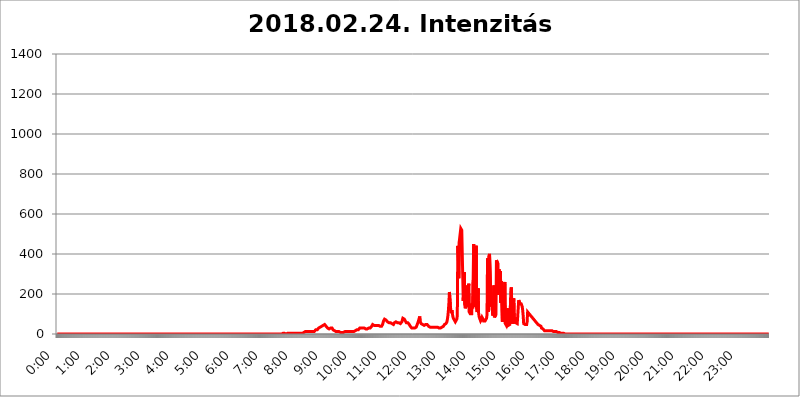
| Category | 2018.02.24. Intenzitás [W/m^2] |
|---|---|
| 0.0 | 0 |
| 0.0006944444444444445 | 0 |
| 0.001388888888888889 | 0 |
| 0.0020833333333333333 | 0 |
| 0.002777777777777778 | 0 |
| 0.003472222222222222 | 0 |
| 0.004166666666666667 | 0 |
| 0.004861111111111111 | 0 |
| 0.005555555555555556 | 0 |
| 0.0062499999999999995 | 0 |
| 0.006944444444444444 | 0 |
| 0.007638888888888889 | 0 |
| 0.008333333333333333 | 0 |
| 0.009027777777777779 | 0 |
| 0.009722222222222222 | 0 |
| 0.010416666666666666 | 0 |
| 0.011111111111111112 | 0 |
| 0.011805555555555555 | 0 |
| 0.012499999999999999 | 0 |
| 0.013194444444444444 | 0 |
| 0.013888888888888888 | 0 |
| 0.014583333333333332 | 0 |
| 0.015277777777777777 | 0 |
| 0.015972222222222224 | 0 |
| 0.016666666666666666 | 0 |
| 0.017361111111111112 | 0 |
| 0.018055555555555557 | 0 |
| 0.01875 | 0 |
| 0.019444444444444445 | 0 |
| 0.02013888888888889 | 0 |
| 0.020833333333333332 | 0 |
| 0.02152777777777778 | 0 |
| 0.022222222222222223 | 0 |
| 0.02291666666666667 | 0 |
| 0.02361111111111111 | 0 |
| 0.024305555555555556 | 0 |
| 0.024999999999999998 | 0 |
| 0.025694444444444447 | 0 |
| 0.02638888888888889 | 0 |
| 0.027083333333333334 | 0 |
| 0.027777777777777776 | 0 |
| 0.02847222222222222 | 0 |
| 0.029166666666666664 | 0 |
| 0.029861111111111113 | 0 |
| 0.030555555555555555 | 0 |
| 0.03125 | 0 |
| 0.03194444444444445 | 0 |
| 0.03263888888888889 | 0 |
| 0.03333333333333333 | 0 |
| 0.034027777777777775 | 0 |
| 0.034722222222222224 | 0 |
| 0.035416666666666666 | 0 |
| 0.036111111111111115 | 0 |
| 0.03680555555555556 | 0 |
| 0.0375 | 0 |
| 0.03819444444444444 | 0 |
| 0.03888888888888889 | 0 |
| 0.03958333333333333 | 0 |
| 0.04027777777777778 | 0 |
| 0.04097222222222222 | 0 |
| 0.041666666666666664 | 0 |
| 0.042361111111111106 | 0 |
| 0.04305555555555556 | 0 |
| 0.043750000000000004 | 0 |
| 0.044444444444444446 | 0 |
| 0.04513888888888889 | 0 |
| 0.04583333333333334 | 0 |
| 0.04652777777777778 | 0 |
| 0.04722222222222222 | 0 |
| 0.04791666666666666 | 0 |
| 0.04861111111111111 | 0 |
| 0.049305555555555554 | 0 |
| 0.049999999999999996 | 0 |
| 0.05069444444444445 | 0 |
| 0.051388888888888894 | 0 |
| 0.052083333333333336 | 0 |
| 0.05277777777777778 | 0 |
| 0.05347222222222222 | 0 |
| 0.05416666666666667 | 0 |
| 0.05486111111111111 | 0 |
| 0.05555555555555555 | 0 |
| 0.05625 | 0 |
| 0.05694444444444444 | 0 |
| 0.057638888888888885 | 0 |
| 0.05833333333333333 | 0 |
| 0.05902777777777778 | 0 |
| 0.059722222222222225 | 0 |
| 0.06041666666666667 | 0 |
| 0.061111111111111116 | 0 |
| 0.06180555555555556 | 0 |
| 0.0625 | 0 |
| 0.06319444444444444 | 0 |
| 0.06388888888888888 | 0 |
| 0.06458333333333334 | 0 |
| 0.06527777777777778 | 0 |
| 0.06597222222222222 | 0 |
| 0.06666666666666667 | 0 |
| 0.06736111111111111 | 0 |
| 0.06805555555555555 | 0 |
| 0.06874999999999999 | 0 |
| 0.06944444444444443 | 0 |
| 0.07013888888888889 | 0 |
| 0.07083333333333333 | 0 |
| 0.07152777777777779 | 0 |
| 0.07222222222222223 | 0 |
| 0.07291666666666667 | 0 |
| 0.07361111111111111 | 0 |
| 0.07430555555555556 | 0 |
| 0.075 | 0 |
| 0.07569444444444444 | 0 |
| 0.0763888888888889 | 0 |
| 0.07708333333333334 | 0 |
| 0.07777777777777778 | 0 |
| 0.07847222222222222 | 0 |
| 0.07916666666666666 | 0 |
| 0.0798611111111111 | 0 |
| 0.08055555555555556 | 0 |
| 0.08125 | 0 |
| 0.08194444444444444 | 0 |
| 0.08263888888888889 | 0 |
| 0.08333333333333333 | 0 |
| 0.08402777777777777 | 0 |
| 0.08472222222222221 | 0 |
| 0.08541666666666665 | 0 |
| 0.08611111111111112 | 0 |
| 0.08680555555555557 | 0 |
| 0.08750000000000001 | 0 |
| 0.08819444444444445 | 0 |
| 0.08888888888888889 | 0 |
| 0.08958333333333333 | 0 |
| 0.09027777777777778 | 0 |
| 0.09097222222222222 | 0 |
| 0.09166666666666667 | 0 |
| 0.09236111111111112 | 0 |
| 0.09305555555555556 | 0 |
| 0.09375 | 0 |
| 0.09444444444444444 | 0 |
| 0.09513888888888888 | 0 |
| 0.09583333333333333 | 0 |
| 0.09652777777777777 | 0 |
| 0.09722222222222222 | 0 |
| 0.09791666666666667 | 0 |
| 0.09861111111111111 | 0 |
| 0.09930555555555555 | 0 |
| 0.09999999999999999 | 0 |
| 0.10069444444444443 | 0 |
| 0.1013888888888889 | 0 |
| 0.10208333333333335 | 0 |
| 0.10277777777777779 | 0 |
| 0.10347222222222223 | 0 |
| 0.10416666666666667 | 0 |
| 0.10486111111111111 | 0 |
| 0.10555555555555556 | 0 |
| 0.10625 | 0 |
| 0.10694444444444444 | 0 |
| 0.1076388888888889 | 0 |
| 0.10833333333333334 | 0 |
| 0.10902777777777778 | 0 |
| 0.10972222222222222 | 0 |
| 0.1111111111111111 | 0 |
| 0.11180555555555556 | 0 |
| 0.11180555555555556 | 0 |
| 0.1125 | 0 |
| 0.11319444444444444 | 0 |
| 0.11388888888888889 | 0 |
| 0.11458333333333333 | 0 |
| 0.11527777777777777 | 0 |
| 0.11597222222222221 | 0 |
| 0.11666666666666665 | 0 |
| 0.1173611111111111 | 0 |
| 0.11805555555555557 | 0 |
| 0.11944444444444445 | 0 |
| 0.12013888888888889 | 0 |
| 0.12083333333333333 | 0 |
| 0.12152777777777778 | 0 |
| 0.12222222222222223 | 0 |
| 0.12291666666666667 | 0 |
| 0.12291666666666667 | 0 |
| 0.12361111111111112 | 0 |
| 0.12430555555555556 | 0 |
| 0.125 | 0 |
| 0.12569444444444444 | 0 |
| 0.12638888888888888 | 0 |
| 0.12708333333333333 | 0 |
| 0.16875 | 0 |
| 0.12847222222222224 | 0 |
| 0.12916666666666668 | 0 |
| 0.12986111111111112 | 0 |
| 0.13055555555555556 | 0 |
| 0.13125 | 0 |
| 0.13194444444444445 | 0 |
| 0.1326388888888889 | 0 |
| 0.13333333333333333 | 0 |
| 0.13402777777777777 | 0 |
| 0.13402777777777777 | 0 |
| 0.13472222222222222 | 0 |
| 0.13541666666666666 | 0 |
| 0.1361111111111111 | 0 |
| 0.13749999999999998 | 0 |
| 0.13819444444444443 | 0 |
| 0.1388888888888889 | 0 |
| 0.13958333333333334 | 0 |
| 0.14027777777777778 | 0 |
| 0.14097222222222222 | 0 |
| 0.14166666666666666 | 0 |
| 0.1423611111111111 | 0 |
| 0.14305555555555557 | 0 |
| 0.14375000000000002 | 0 |
| 0.14444444444444446 | 0 |
| 0.1451388888888889 | 0 |
| 0.1451388888888889 | 0 |
| 0.14652777777777778 | 0 |
| 0.14722222222222223 | 0 |
| 0.14791666666666667 | 0 |
| 0.1486111111111111 | 0 |
| 0.14930555555555555 | 0 |
| 0.15 | 0 |
| 0.15069444444444444 | 0 |
| 0.15138888888888888 | 0 |
| 0.15208333333333332 | 0 |
| 0.15277777777777776 | 0 |
| 0.15347222222222223 | 0 |
| 0.15416666666666667 | 0 |
| 0.15486111111111112 | 0 |
| 0.15555555555555556 | 0 |
| 0.15625 | 0 |
| 0.15694444444444444 | 0 |
| 0.15763888888888888 | 0 |
| 0.15833333333333333 | 0 |
| 0.15902777777777777 | 0 |
| 0.15972222222222224 | 0 |
| 0.16041666666666668 | 0 |
| 0.16111111111111112 | 0 |
| 0.16180555555555556 | 0 |
| 0.1625 | 0 |
| 0.16319444444444445 | 0 |
| 0.1638888888888889 | 0 |
| 0.16458333333333333 | 0 |
| 0.16527777777777777 | 0 |
| 0.16597222222222222 | 0 |
| 0.16666666666666666 | 0 |
| 0.1673611111111111 | 0 |
| 0.16805555555555554 | 0 |
| 0.16874999999999998 | 0 |
| 0.16944444444444443 | 0 |
| 0.17013888888888887 | 0 |
| 0.1708333333333333 | 0 |
| 0.17152777777777775 | 0 |
| 0.17222222222222225 | 0 |
| 0.1729166666666667 | 0 |
| 0.17361111111111113 | 0 |
| 0.17430555555555557 | 0 |
| 0.17500000000000002 | 0 |
| 0.17569444444444446 | 0 |
| 0.1763888888888889 | 0 |
| 0.17708333333333334 | 0 |
| 0.17777777777777778 | 0 |
| 0.17847222222222223 | 0 |
| 0.17916666666666667 | 0 |
| 0.1798611111111111 | 0 |
| 0.18055555555555555 | 0 |
| 0.18125 | 0 |
| 0.18194444444444444 | 0 |
| 0.1826388888888889 | 0 |
| 0.18333333333333335 | 0 |
| 0.1840277777777778 | 0 |
| 0.18472222222222223 | 0 |
| 0.18541666666666667 | 0 |
| 0.18611111111111112 | 0 |
| 0.18680555555555556 | 0 |
| 0.1875 | 0 |
| 0.18819444444444444 | 0 |
| 0.18888888888888888 | 0 |
| 0.18958333333333333 | 0 |
| 0.19027777777777777 | 0 |
| 0.1909722222222222 | 0 |
| 0.19166666666666665 | 0 |
| 0.19236111111111112 | 0 |
| 0.19305555555555554 | 0 |
| 0.19375 | 0 |
| 0.19444444444444445 | 0 |
| 0.1951388888888889 | 0 |
| 0.19583333333333333 | 0 |
| 0.19652777777777777 | 0 |
| 0.19722222222222222 | 0 |
| 0.19791666666666666 | 0 |
| 0.1986111111111111 | 0 |
| 0.19930555555555554 | 0 |
| 0.19999999999999998 | 0 |
| 0.20069444444444443 | 0 |
| 0.20138888888888887 | 0 |
| 0.2020833333333333 | 0 |
| 0.2027777777777778 | 0 |
| 0.2034722222222222 | 0 |
| 0.2041666666666667 | 0 |
| 0.20486111111111113 | 0 |
| 0.20555555555555557 | 0 |
| 0.20625000000000002 | 0 |
| 0.20694444444444446 | 0 |
| 0.2076388888888889 | 0 |
| 0.20833333333333334 | 0 |
| 0.20902777777777778 | 0 |
| 0.20972222222222223 | 0 |
| 0.21041666666666667 | 0 |
| 0.2111111111111111 | 0 |
| 0.21180555555555555 | 0 |
| 0.2125 | 0 |
| 0.21319444444444444 | 0 |
| 0.2138888888888889 | 0 |
| 0.21458333333333335 | 0 |
| 0.2152777777777778 | 0 |
| 0.21597222222222223 | 0 |
| 0.21666666666666667 | 0 |
| 0.21736111111111112 | 0 |
| 0.21805555555555556 | 0 |
| 0.21875 | 0 |
| 0.21944444444444444 | 0 |
| 0.22013888888888888 | 0 |
| 0.22083333333333333 | 0 |
| 0.22152777777777777 | 0 |
| 0.2222222222222222 | 0 |
| 0.22291666666666665 | 0 |
| 0.2236111111111111 | 0 |
| 0.22430555555555556 | 0 |
| 0.225 | 0 |
| 0.22569444444444445 | 0 |
| 0.2263888888888889 | 0 |
| 0.22708333333333333 | 0 |
| 0.22777777777777777 | 0 |
| 0.22847222222222222 | 0 |
| 0.22916666666666666 | 0 |
| 0.2298611111111111 | 0 |
| 0.23055555555555554 | 0 |
| 0.23124999999999998 | 0 |
| 0.23194444444444443 | 0 |
| 0.23263888888888887 | 0 |
| 0.2333333333333333 | 0 |
| 0.2340277777777778 | 0 |
| 0.2347222222222222 | 0 |
| 0.2354166666666667 | 0 |
| 0.23611111111111113 | 0 |
| 0.23680555555555557 | 0 |
| 0.23750000000000002 | 0 |
| 0.23819444444444446 | 0 |
| 0.2388888888888889 | 0 |
| 0.23958333333333334 | 0 |
| 0.24027777777777778 | 0 |
| 0.24097222222222223 | 0 |
| 0.24166666666666667 | 0 |
| 0.2423611111111111 | 0 |
| 0.24305555555555555 | 0 |
| 0.24375 | 0 |
| 0.24444444444444446 | 0 |
| 0.24513888888888888 | 0 |
| 0.24583333333333335 | 0 |
| 0.2465277777777778 | 0 |
| 0.24722222222222223 | 0 |
| 0.24791666666666667 | 0 |
| 0.24861111111111112 | 0 |
| 0.24930555555555556 | 0 |
| 0.25 | 0 |
| 0.25069444444444444 | 0 |
| 0.2513888888888889 | 0 |
| 0.2520833333333333 | 0 |
| 0.25277777777777777 | 0 |
| 0.2534722222222222 | 0 |
| 0.25416666666666665 | 0 |
| 0.2548611111111111 | 0 |
| 0.2555555555555556 | 0 |
| 0.25625000000000003 | 0 |
| 0.2569444444444445 | 0 |
| 0.2576388888888889 | 0 |
| 0.25833333333333336 | 0 |
| 0.2590277777777778 | 0 |
| 0.25972222222222224 | 0 |
| 0.2604166666666667 | 0 |
| 0.2611111111111111 | 0 |
| 0.26180555555555557 | 0 |
| 0.2625 | 0 |
| 0.26319444444444445 | 0 |
| 0.2638888888888889 | 0 |
| 0.26458333333333334 | 0 |
| 0.2652777777777778 | 0 |
| 0.2659722222222222 | 0 |
| 0.26666666666666666 | 0 |
| 0.2673611111111111 | 0 |
| 0.26805555555555555 | 0 |
| 0.26875 | 0 |
| 0.26944444444444443 | 0 |
| 0.2701388888888889 | 0 |
| 0.2708333333333333 | 0 |
| 0.27152777777777776 | 0 |
| 0.2722222222222222 | 0 |
| 0.27291666666666664 | 0 |
| 0.2736111111111111 | 0 |
| 0.2743055555555555 | 0 |
| 0.27499999999999997 | 0 |
| 0.27569444444444446 | 0 |
| 0.27638888888888885 | 0 |
| 0.27708333333333335 | 0 |
| 0.2777777777777778 | 0 |
| 0.27847222222222223 | 0 |
| 0.2791666666666667 | 0 |
| 0.2798611111111111 | 0 |
| 0.28055555555555556 | 0 |
| 0.28125 | 0 |
| 0.28194444444444444 | 0 |
| 0.2826388888888889 | 0 |
| 0.2833333333333333 | 0 |
| 0.28402777777777777 | 0 |
| 0.2847222222222222 | 0 |
| 0.28541666666666665 | 0 |
| 0.28611111111111115 | 0 |
| 0.28680555555555554 | 0 |
| 0.28750000000000003 | 0 |
| 0.2881944444444445 | 0 |
| 0.2888888888888889 | 0 |
| 0.28958333333333336 | 0 |
| 0.2902777777777778 | 0 |
| 0.29097222222222224 | 0 |
| 0.2916666666666667 | 0 |
| 0.2923611111111111 | 0 |
| 0.29305555555555557 | 0 |
| 0.29375 | 0 |
| 0.29444444444444445 | 0 |
| 0.2951388888888889 | 0 |
| 0.29583333333333334 | 0 |
| 0.2965277777777778 | 0 |
| 0.2972222222222222 | 0 |
| 0.29791666666666666 | 0 |
| 0.2986111111111111 | 0 |
| 0.29930555555555555 | 0 |
| 0.3 | 0 |
| 0.30069444444444443 | 0 |
| 0.3013888888888889 | 0 |
| 0.3020833333333333 | 0 |
| 0.30277777777777776 | 0 |
| 0.3034722222222222 | 0 |
| 0.30416666666666664 | 0 |
| 0.3048611111111111 | 0 |
| 0.3055555555555555 | 0 |
| 0.30624999999999997 | 0 |
| 0.3069444444444444 | 0 |
| 0.3076388888888889 | 0 |
| 0.30833333333333335 | 0 |
| 0.3090277777777778 | 0 |
| 0.30972222222222223 | 0 |
| 0.3104166666666667 | 0 |
| 0.3111111111111111 | 0 |
| 0.31180555555555556 | 0 |
| 0.3125 | 0 |
| 0.31319444444444444 | 0 |
| 0.3138888888888889 | 0 |
| 0.3145833333333333 | 0 |
| 0.31527777777777777 | 3.525 |
| 0.3159722222222222 | 0 |
| 0.31666666666666665 | 3.525 |
| 0.31736111111111115 | 3.525 |
| 0.31805555555555554 | 3.525 |
| 0.31875000000000003 | 3.525 |
| 0.3194444444444445 | 3.525 |
| 0.3201388888888889 | 3.525 |
| 0.32083333333333336 | 0 |
| 0.3215277777777778 | 3.525 |
| 0.32222222222222224 | 3.525 |
| 0.3229166666666667 | 3.525 |
| 0.3236111111111111 | 3.525 |
| 0.32430555555555557 | 3.525 |
| 0.325 | 3.525 |
| 0.32569444444444445 | 3.525 |
| 0.3263888888888889 | 3.525 |
| 0.32708333333333334 | 3.525 |
| 0.3277777777777778 | 3.525 |
| 0.3284722222222222 | 3.525 |
| 0.32916666666666666 | 3.525 |
| 0.3298611111111111 | 3.525 |
| 0.33055555555555555 | 3.525 |
| 0.33125 | 3.525 |
| 0.33194444444444443 | 0 |
| 0.3326388888888889 | 3.525 |
| 0.3333333333333333 | 3.525 |
| 0.3340277777777778 | 3.525 |
| 0.3347222222222222 | 3.525 |
| 0.3354166666666667 | 3.525 |
| 0.3361111111111111 | 3.525 |
| 0.3368055555555556 | 3.525 |
| 0.33749999999999997 | 3.525 |
| 0.33819444444444446 | 3.525 |
| 0.33888888888888885 | 3.525 |
| 0.33958333333333335 | 3.525 |
| 0.34027777777777773 | 3.525 |
| 0.34097222222222223 | 3.525 |
| 0.3416666666666666 | 3.525 |
| 0.3423611111111111 | 3.525 |
| 0.3430555555555555 | 3.525 |
| 0.34375 | 3.525 |
| 0.3444444444444445 | 7.887 |
| 0.3451388888888889 | 7.887 |
| 0.3458333333333334 | 7.887 |
| 0.34652777777777777 | 7.887 |
| 0.34722222222222227 | 7.887 |
| 0.34791666666666665 | 12.257 |
| 0.34861111111111115 | 12.257 |
| 0.34930555555555554 | 12.257 |
| 0.35000000000000003 | 12.257 |
| 0.3506944444444444 | 12.257 |
| 0.3513888888888889 | 12.257 |
| 0.3520833333333333 | 12.257 |
| 0.3527777777777778 | 12.257 |
| 0.3534722222222222 | 12.257 |
| 0.3541666666666667 | 12.257 |
| 0.3548611111111111 | 12.257 |
| 0.35555555555555557 | 12.257 |
| 0.35625 | 12.257 |
| 0.35694444444444445 | 12.257 |
| 0.3576388888888889 | 12.257 |
| 0.35833333333333334 | 12.257 |
| 0.3590277777777778 | 12.257 |
| 0.3597222222222222 | 12.257 |
| 0.36041666666666666 | 12.257 |
| 0.3611111111111111 | 12.257 |
| 0.36180555555555555 | 16.636 |
| 0.3625 | 21.024 |
| 0.36319444444444443 | 21.024 |
| 0.3638888888888889 | 21.024 |
| 0.3645833333333333 | 21.024 |
| 0.3652777777777778 | 25.419 |
| 0.3659722222222222 | 25.419 |
| 0.3666666666666667 | 29.823 |
| 0.3673611111111111 | 34.234 |
| 0.3680555555555556 | 34.234 |
| 0.36874999999999997 | 34.234 |
| 0.36944444444444446 | 34.234 |
| 0.37013888888888885 | 34.234 |
| 0.37083333333333335 | 38.653 |
| 0.37152777777777773 | 38.653 |
| 0.37222222222222223 | 43.079 |
| 0.3729166666666666 | 43.079 |
| 0.3736111111111111 | 43.079 |
| 0.3743055555555555 | 47.511 |
| 0.375 | 47.511 |
| 0.3756944444444445 | 43.079 |
| 0.3763888888888889 | 43.079 |
| 0.3770833333333334 | 38.653 |
| 0.37777777777777777 | 38.653 |
| 0.37847222222222227 | 34.234 |
| 0.37916666666666665 | 29.823 |
| 0.37986111111111115 | 29.823 |
| 0.38055555555555554 | 25.419 |
| 0.38125000000000003 | 25.419 |
| 0.3819444444444444 | 25.419 |
| 0.3826388888888889 | 25.419 |
| 0.3833333333333333 | 29.823 |
| 0.3840277777777778 | 34.234 |
| 0.3847222222222222 | 34.234 |
| 0.3854166666666667 | 29.823 |
| 0.3861111111111111 | 25.419 |
| 0.38680555555555557 | 21.024 |
| 0.3875 | 21.024 |
| 0.38819444444444445 | 16.636 |
| 0.3888888888888889 | 16.636 |
| 0.38958333333333334 | 12.257 |
| 0.3902777777777778 | 12.257 |
| 0.3909722222222222 | 12.257 |
| 0.39166666666666666 | 12.257 |
| 0.3923611111111111 | 12.257 |
| 0.39305555555555555 | 12.257 |
| 0.39375 | 12.257 |
| 0.39444444444444443 | 12.257 |
| 0.3951388888888889 | 12.257 |
| 0.3958333333333333 | 7.887 |
| 0.3965277777777778 | 7.887 |
| 0.3972222222222222 | 7.887 |
| 0.3979166666666667 | 7.887 |
| 0.3986111111111111 | 7.887 |
| 0.3993055555555556 | 7.887 |
| 0.39999999999999997 | 7.887 |
| 0.40069444444444446 | 7.887 |
| 0.40138888888888885 | 7.887 |
| 0.40208333333333335 | 7.887 |
| 0.40277777777777773 | 7.887 |
| 0.40347222222222223 | 12.257 |
| 0.4041666666666666 | 12.257 |
| 0.4048611111111111 | 12.257 |
| 0.4055555555555555 | 12.257 |
| 0.40625 | 12.257 |
| 0.4069444444444445 | 12.257 |
| 0.4076388888888889 | 12.257 |
| 0.4083333333333334 | 12.257 |
| 0.40902777777777777 | 12.257 |
| 0.40972222222222227 | 12.257 |
| 0.41041666666666665 | 12.257 |
| 0.41111111111111115 | 12.257 |
| 0.41180555555555554 | 12.257 |
| 0.41250000000000003 | 12.257 |
| 0.4131944444444444 | 12.257 |
| 0.4138888888888889 | 12.257 |
| 0.4145833333333333 | 12.257 |
| 0.4152777777777778 | 12.257 |
| 0.4159722222222222 | 12.257 |
| 0.4166666666666667 | 12.257 |
| 0.4173611111111111 | 16.636 |
| 0.41805555555555557 | 16.636 |
| 0.41875 | 16.636 |
| 0.41944444444444445 | 16.636 |
| 0.4201388888888889 | 21.024 |
| 0.42083333333333334 | 21.024 |
| 0.4215277777777778 | 21.024 |
| 0.4222222222222222 | 21.024 |
| 0.42291666666666666 | 25.419 |
| 0.4236111111111111 | 25.419 |
| 0.42430555555555555 | 29.823 |
| 0.425 | 29.823 |
| 0.42569444444444443 | 29.823 |
| 0.4263888888888889 | 29.823 |
| 0.4270833333333333 | 29.823 |
| 0.4277777777777778 | 29.823 |
| 0.4284722222222222 | 29.823 |
| 0.4291666666666667 | 29.823 |
| 0.4298611111111111 | 29.823 |
| 0.4305555555555556 | 29.823 |
| 0.43124999999999997 | 29.823 |
| 0.43194444444444446 | 25.419 |
| 0.43263888888888885 | 25.419 |
| 0.43333333333333335 | 25.419 |
| 0.43402777777777773 | 25.419 |
| 0.43472222222222223 | 25.419 |
| 0.4354166666666666 | 25.419 |
| 0.4361111111111111 | 29.823 |
| 0.4368055555555555 | 29.823 |
| 0.4375 | 29.823 |
| 0.4381944444444445 | 25.419 |
| 0.4388888888888889 | 29.823 |
| 0.4395833333333334 | 29.823 |
| 0.44027777777777777 | 34.234 |
| 0.44097222222222227 | 38.653 |
| 0.44166666666666665 | 43.079 |
| 0.44236111111111115 | 47.511 |
| 0.44305555555555554 | 47.511 |
| 0.44375000000000003 | 47.511 |
| 0.4444444444444444 | 43.079 |
| 0.4451388888888889 | 43.079 |
| 0.4458333333333333 | 43.079 |
| 0.4465277777777778 | 43.079 |
| 0.4472222222222222 | 43.079 |
| 0.4479166666666667 | 43.079 |
| 0.4486111111111111 | 43.079 |
| 0.44930555555555557 | 43.079 |
| 0.45 | 43.079 |
| 0.45069444444444445 | 43.079 |
| 0.4513888888888889 | 43.079 |
| 0.45208333333333334 | 43.079 |
| 0.4527777777777778 | 38.653 |
| 0.4534722222222222 | 38.653 |
| 0.45416666666666666 | 38.653 |
| 0.4548611111111111 | 38.653 |
| 0.45555555555555555 | 43.079 |
| 0.45625 | 47.511 |
| 0.45694444444444443 | 56.398 |
| 0.4576388888888889 | 65.31 |
| 0.4583333333333333 | 69.775 |
| 0.4590277777777778 | 74.246 |
| 0.4597222222222222 | 74.246 |
| 0.4604166666666667 | 74.246 |
| 0.4611111111111111 | 69.775 |
| 0.4618055555555556 | 69.775 |
| 0.46249999999999997 | 65.31 |
| 0.46319444444444446 | 60.85 |
| 0.46388888888888885 | 60.85 |
| 0.46458333333333335 | 56.398 |
| 0.46527777777777773 | 56.398 |
| 0.46597222222222223 | 56.398 |
| 0.4666666666666666 | 56.398 |
| 0.4673611111111111 | 56.398 |
| 0.4680555555555555 | 56.398 |
| 0.46875 | 56.398 |
| 0.4694444444444445 | 51.951 |
| 0.4701388888888889 | 51.951 |
| 0.4708333333333334 | 51.951 |
| 0.47152777777777777 | 47.511 |
| 0.47222222222222227 | 51.951 |
| 0.47291666666666665 | 56.398 |
| 0.47361111111111115 | 56.398 |
| 0.47430555555555554 | 60.85 |
| 0.47500000000000003 | 60.85 |
| 0.4756944444444444 | 56.398 |
| 0.4763888888888889 | 56.398 |
| 0.4770833333333333 | 56.398 |
| 0.4777777777777778 | 51.951 |
| 0.4784722222222222 | 51.951 |
| 0.4791666666666667 | 56.398 |
| 0.4798611111111111 | 56.398 |
| 0.48055555555555557 | 56.398 |
| 0.48125 | 51.951 |
| 0.48194444444444445 | 51.951 |
| 0.4826388888888889 | 51.951 |
| 0.48333333333333334 | 60.85 |
| 0.4840277777777778 | 65.31 |
| 0.4847222222222222 | 78.722 |
| 0.48541666666666666 | 78.722 |
| 0.4861111111111111 | 74.246 |
| 0.48680555555555555 | 74.246 |
| 0.4875 | 69.775 |
| 0.48819444444444443 | 65.31 |
| 0.4888888888888889 | 60.85 |
| 0.4895833333333333 | 56.398 |
| 0.4902777777777778 | 56.398 |
| 0.4909722222222222 | 56.398 |
| 0.4916666666666667 | 56.398 |
| 0.4923611111111111 | 56.398 |
| 0.4930555555555556 | 51.951 |
| 0.49374999999999997 | 47.511 |
| 0.49444444444444446 | 43.079 |
| 0.49513888888888885 | 38.653 |
| 0.49583333333333335 | 38.653 |
| 0.49652777777777773 | 34.234 |
| 0.49722222222222223 | 29.823 |
| 0.4979166666666666 | 29.823 |
| 0.4986111111111111 | 29.823 |
| 0.4993055555555555 | 29.823 |
| 0.5 | 29.823 |
| 0.5006944444444444 | 29.823 |
| 0.5013888888888889 | 29.823 |
| 0.5020833333333333 | 29.823 |
| 0.5027777777777778 | 29.823 |
| 0.5034722222222222 | 34.234 |
| 0.5041666666666667 | 38.653 |
| 0.5048611111111111 | 47.511 |
| 0.5055555555555555 | 51.951 |
| 0.50625 | 60.85 |
| 0.5069444444444444 | 69.775 |
| 0.5076388888888889 | 69.775 |
| 0.5083333333333333 | 87.692 |
| 0.5090277777777777 | 60.85 |
| 0.5097222222222222 | 56.398 |
| 0.5104166666666666 | 51.951 |
| 0.5111111111111112 | 47.511 |
| 0.5118055555555555 | 47.511 |
| 0.5125000000000001 | 47.511 |
| 0.5131944444444444 | 43.079 |
| 0.513888888888889 | 43.079 |
| 0.5145833333333333 | 43.079 |
| 0.5152777777777778 | 43.079 |
| 0.5159722222222222 | 47.511 |
| 0.5166666666666667 | 47.511 |
| 0.517361111111111 | 51.951 |
| 0.5180555555555556 | 47.511 |
| 0.5187499999999999 | 47.511 |
| 0.5194444444444445 | 43.079 |
| 0.5201388888888888 | 43.079 |
| 0.5208333333333334 | 38.653 |
| 0.5215277777777778 | 38.653 |
| 0.5222222222222223 | 34.234 |
| 0.5229166666666667 | 34.234 |
| 0.5236111111111111 | 34.234 |
| 0.5243055555555556 | 34.234 |
| 0.525 | 34.234 |
| 0.5256944444444445 | 34.234 |
| 0.5263888888888889 | 34.234 |
| 0.5270833333333333 | 34.234 |
| 0.5277777777777778 | 34.234 |
| 0.5284722222222222 | 34.234 |
| 0.5291666666666667 | 34.234 |
| 0.5298611111111111 | 34.234 |
| 0.5305555555555556 | 34.234 |
| 0.53125 | 34.234 |
| 0.5319444444444444 | 34.234 |
| 0.5326388888888889 | 34.234 |
| 0.5333333333333333 | 34.234 |
| 0.5340277777777778 | 34.234 |
| 0.5347222222222222 | 29.823 |
| 0.5354166666666667 | 29.823 |
| 0.5361111111111111 | 29.823 |
| 0.5368055555555555 | 29.823 |
| 0.5375 | 29.823 |
| 0.5381944444444444 | 29.823 |
| 0.5388888888888889 | 29.823 |
| 0.5395833333333333 | 34.234 |
| 0.5402777777777777 | 34.234 |
| 0.5409722222222222 | 38.653 |
| 0.5416666666666666 | 38.653 |
| 0.5423611111111112 | 43.079 |
| 0.5430555555555555 | 47.511 |
| 0.5437500000000001 | 51.951 |
| 0.5444444444444444 | 51.951 |
| 0.545138888888889 | 51.951 |
| 0.5458333333333333 | 56.398 |
| 0.5465277777777778 | 60.85 |
| 0.5472222222222222 | 74.246 |
| 0.5479166666666667 | 92.184 |
| 0.548611111111111 | 119.235 |
| 0.5493055555555556 | 155.509 |
| 0.5499999999999999 | 210.182 |
| 0.5506944444444445 | 205.62 |
| 0.5513888888888888 | 141.884 |
| 0.5520833333333334 | 114.716 |
| 0.5527777777777778 | 105.69 |
| 0.5534722222222223 | 119.235 |
| 0.5541666666666667 | 101.184 |
| 0.5548611111111111 | 87.692 |
| 0.5555555555555556 | 78.722 |
| 0.55625 | 74.246 |
| 0.5569444444444445 | 69.775 |
| 0.5576388888888889 | 65.31 |
| 0.5583333333333333 | 60.85 |
| 0.5590277777777778 | 56.398 |
| 0.5597222222222222 | 60.85 |
| 0.5604166666666667 | 74.246 |
| 0.5611111111111111 | 92.184 |
| 0.5618055555555556 | 440.702 |
| 0.5625 | 382.715 |
| 0.5631944444444444 | 278.603 |
| 0.5638888888888889 | 462.786 |
| 0.5645833333333333 | 458.38 |
| 0.5652777777777778 | 506.542 |
| 0.5659722222222222 | 528.2 |
| 0.5666666666666667 | 532.513 |
| 0.5673611111111111 | 519.555 |
| 0.5680555555555555 | 519.555 |
| 0.56875 | 523.88 |
| 0.5694444444444444 | 164.605 |
| 0.5701388888888889 | 160.056 |
| 0.5708333333333333 | 310.44 |
| 0.5715277777777777 | 146.423 |
| 0.5722222222222222 | 128.284 |
| 0.5729166666666666 | 137.347 |
| 0.5736111111111112 | 137.347 |
| 0.5743055555555555 | 155.509 |
| 0.5750000000000001 | 242.127 |
| 0.5756944444444444 | 137.347 |
| 0.576388888888889 | 132.814 |
| 0.5770833333333333 | 251.251 |
| 0.5777777777777778 | 110.201 |
| 0.5784722222222222 | 105.69 |
| 0.5791666666666667 | 101.184 |
| 0.579861111111111 | 101.184 |
| 0.5805555555555556 | 105.69 |
| 0.5812499999999999 | 101.184 |
| 0.5819444444444445 | 155.509 |
| 0.5826388888888888 | 128.284 |
| 0.5833333333333334 | 269.49 |
| 0.5840277777777778 | 449.551 |
| 0.5847222222222223 | 146.423 |
| 0.5854166666666667 | 137.347 |
| 0.5861111111111111 | 274.047 |
| 0.5868055555555556 | 137.347 |
| 0.5875 | 440.702 |
| 0.5881944444444445 | 128.284 |
| 0.5888888888888889 | 110.201 |
| 0.5895833333333333 | 105.69 |
| 0.5902777777777778 | 228.436 |
| 0.5909722222222222 | 105.69 |
| 0.5916666666666667 | 87.692 |
| 0.5923611111111111 | 78.722 |
| 0.5930555555555556 | 74.246 |
| 0.59375 | 65.31 |
| 0.5944444444444444 | 65.31 |
| 0.5951388888888889 | 74.246 |
| 0.5958333333333333 | 83.205 |
| 0.5965277777777778 | 83.205 |
| 0.5972222222222222 | 74.246 |
| 0.5979166666666667 | 65.31 |
| 0.5986111111111111 | 65.31 |
| 0.5993055555555555 | 65.31 |
| 0.6 | 65.31 |
| 0.6006944444444444 | 65.31 |
| 0.6013888888888889 | 65.31 |
| 0.6020833333333333 | 78.722 |
| 0.6027777777777777 | 96.682 |
| 0.6034722222222222 | 378.224 |
| 0.6041666666666666 | 301.354 |
| 0.6048611111111112 | 110.201 |
| 0.6055555555555555 | 391.685 |
| 0.6062500000000001 | 400.638 |
| 0.6069444444444444 | 396.164 |
| 0.607638888888889 | 405.108 |
| 0.6083333333333333 | 169.156 |
| 0.6090277777777778 | 137.347 |
| 0.6097222222222222 | 182.82 |
| 0.6104166666666667 | 101.184 |
| 0.611111111111111 | 92.184 |
| 0.6118055555555556 | 96.682 |
| 0.6124999999999999 | 242.127 |
| 0.6131944444444445 | 83.205 |
| 0.6138888888888888 | 83.205 |
| 0.6145833333333334 | 83.205 |
| 0.6152777777777778 | 96.682 |
| 0.6159722222222223 | 369.23 |
| 0.6166666666666667 | 369.23 |
| 0.6173611111111111 | 364.728 |
| 0.6180555555555556 | 351.198 |
| 0.61875 | 196.497 |
| 0.6194444444444445 | 324.052 |
| 0.6201388888888889 | 214.746 |
| 0.6208333333333333 | 278.603 |
| 0.6215277777777778 | 314.98 |
| 0.6222222222222222 | 155.509 |
| 0.6229166666666667 | 264.932 |
| 0.6236111111111111 | 269.49 |
| 0.6243055555555556 | 60.85 |
| 0.625 | 56.398 |
| 0.6256944444444444 | 56.398 |
| 0.6263888888888889 | 187.378 |
| 0.6270833333333333 | 228.436 |
| 0.6277777777777778 | 260.373 |
| 0.6284722222222222 | 51.951 |
| 0.6291666666666667 | 51.951 |
| 0.6298611111111111 | 43.079 |
| 0.6305555555555555 | 56.398 |
| 0.63125 | 128.284 |
| 0.6319444444444444 | 87.692 |
| 0.6326388888888889 | 43.079 |
| 0.6333333333333333 | 38.653 |
| 0.6340277777777777 | 47.511 |
| 0.6347222222222222 | 47.511 |
| 0.6354166666666666 | 51.951 |
| 0.6361111111111112 | 210.182 |
| 0.6368055555555555 | 233 |
| 0.6375000000000001 | 228.436 |
| 0.6381944444444444 | 51.951 |
| 0.638888888888889 | 65.31 |
| 0.6395833333333333 | 60.85 |
| 0.6402777777777778 | 178.264 |
| 0.6409722222222222 | 78.722 |
| 0.6416666666666667 | 51.951 |
| 0.642361111111111 | 83.205 |
| 0.6430555555555556 | 56.398 |
| 0.6437499999999999 | 51.951 |
| 0.6444444444444445 | 56.398 |
| 0.6451388888888888 | 51.951 |
| 0.6458333333333334 | 56.398 |
| 0.6465277777777778 | 56.398 |
| 0.6472222222222223 | 169.156 |
| 0.6479166666666667 | 164.605 |
| 0.6486111111111111 | 155.509 |
| 0.6493055555555556 | 155.509 |
| 0.65 | 150.964 |
| 0.6506944444444445 | 150.964 |
| 0.6513888888888889 | 146.423 |
| 0.6520833333333333 | 137.347 |
| 0.6527777777777778 | 119.235 |
| 0.6534722222222222 | 92.184 |
| 0.6541666666666667 | 51.951 |
| 0.6548611111111111 | 51.951 |
| 0.6555555555555556 | 47.511 |
| 0.65625 | 47.511 |
| 0.6569444444444444 | 47.511 |
| 0.6576388888888889 | 47.511 |
| 0.6583333333333333 | 47.511 |
| 0.6590277777777778 | 60.85 |
| 0.6597222222222222 | 110.201 |
| 0.6604166666666667 | 110.201 |
| 0.6611111111111111 | 105.69 |
| 0.6618055555555555 | 101.184 |
| 0.6625 | 96.682 |
| 0.6631944444444444 | 96.682 |
| 0.6638888888888889 | 92.184 |
| 0.6645833333333333 | 87.692 |
| 0.6652777777777777 | 87.692 |
| 0.6659722222222222 | 83.205 |
| 0.6666666666666666 | 83.205 |
| 0.6673611111111111 | 78.722 |
| 0.6680555555555556 | 74.246 |
| 0.6687500000000001 | 74.246 |
| 0.6694444444444444 | 69.775 |
| 0.6701388888888888 | 65.31 |
| 0.6708333333333334 | 65.31 |
| 0.6715277777777778 | 60.85 |
| 0.6722222222222222 | 56.398 |
| 0.6729166666666666 | 56.398 |
| 0.6736111111111112 | 51.951 |
| 0.6743055555555556 | 47.511 |
| 0.6749999999999999 | 47.511 |
| 0.6756944444444444 | 43.079 |
| 0.6763888888888889 | 43.079 |
| 0.6770833333333334 | 43.079 |
| 0.6777777777777777 | 38.653 |
| 0.6784722222222223 | 38.653 |
| 0.6791666666666667 | 29.823 |
| 0.6798611111111111 | 29.823 |
| 0.6805555555555555 | 25.419 |
| 0.68125 | 25.419 |
| 0.6819444444444445 | 25.419 |
| 0.6826388888888889 | 21.024 |
| 0.6833333333333332 | 16.636 |
| 0.6840277777777778 | 16.636 |
| 0.6847222222222222 | 16.636 |
| 0.6854166666666667 | 16.636 |
| 0.686111111111111 | 16.636 |
| 0.6868055555555556 | 16.636 |
| 0.6875 | 16.636 |
| 0.6881944444444444 | 16.636 |
| 0.688888888888889 | 16.636 |
| 0.6895833333333333 | 16.636 |
| 0.6902777777777778 | 12.257 |
| 0.6909722222222222 | 16.636 |
| 0.6916666666666668 | 16.636 |
| 0.6923611111111111 | 16.636 |
| 0.6930555555555555 | 16.636 |
| 0.69375 | 16.636 |
| 0.6944444444444445 | 16.636 |
| 0.6951388888888889 | 12.257 |
| 0.6958333333333333 | 12.257 |
| 0.6965277777777777 | 12.257 |
| 0.6972222222222223 | 12.257 |
| 0.6979166666666666 | 12.257 |
| 0.6986111111111111 | 12.257 |
| 0.6993055555555556 | 12.257 |
| 0.7000000000000001 | 12.257 |
| 0.7006944444444444 | 7.887 |
| 0.7013888888888888 | 7.887 |
| 0.7020833333333334 | 7.887 |
| 0.7027777777777778 | 7.887 |
| 0.7034722222222222 | 7.887 |
| 0.7041666666666666 | 7.887 |
| 0.7048611111111112 | 7.887 |
| 0.7055555555555556 | 3.525 |
| 0.7062499999999999 | 3.525 |
| 0.7069444444444444 | 3.525 |
| 0.7076388888888889 | 3.525 |
| 0.7083333333333334 | 3.525 |
| 0.7090277777777777 | 3.525 |
| 0.7097222222222223 | 3.525 |
| 0.7104166666666667 | 3.525 |
| 0.7111111111111111 | 3.525 |
| 0.7118055555555555 | 3.525 |
| 0.7125 | 0 |
| 0.7131944444444445 | 0 |
| 0.7138888888888889 | 0 |
| 0.7145833333333332 | 0 |
| 0.7152777777777778 | 0 |
| 0.7159722222222222 | 0 |
| 0.7166666666666667 | 0 |
| 0.717361111111111 | 0 |
| 0.7180555555555556 | 0 |
| 0.71875 | 0 |
| 0.7194444444444444 | 0 |
| 0.720138888888889 | 0 |
| 0.7208333333333333 | 0 |
| 0.7215277777777778 | 0 |
| 0.7222222222222222 | 0 |
| 0.7229166666666668 | 0 |
| 0.7236111111111111 | 0 |
| 0.7243055555555555 | 0 |
| 0.725 | 0 |
| 0.7256944444444445 | 0 |
| 0.7263888888888889 | 0 |
| 0.7270833333333333 | 0 |
| 0.7277777777777777 | 0 |
| 0.7284722222222223 | 0 |
| 0.7291666666666666 | 0 |
| 0.7298611111111111 | 0 |
| 0.7305555555555556 | 0 |
| 0.7312500000000001 | 0 |
| 0.7319444444444444 | 0 |
| 0.7326388888888888 | 0 |
| 0.7333333333333334 | 0 |
| 0.7340277777777778 | 0 |
| 0.7347222222222222 | 0 |
| 0.7354166666666666 | 0 |
| 0.7361111111111112 | 0 |
| 0.7368055555555556 | 0 |
| 0.7374999999999999 | 0 |
| 0.7381944444444444 | 0 |
| 0.7388888888888889 | 0 |
| 0.7395833333333334 | 0 |
| 0.7402777777777777 | 0 |
| 0.7409722222222223 | 0 |
| 0.7416666666666667 | 0 |
| 0.7423611111111111 | 0 |
| 0.7430555555555555 | 0 |
| 0.74375 | 0 |
| 0.7444444444444445 | 0 |
| 0.7451388888888889 | 0 |
| 0.7458333333333332 | 0 |
| 0.7465277777777778 | 0 |
| 0.7472222222222222 | 0 |
| 0.7479166666666667 | 0 |
| 0.748611111111111 | 0 |
| 0.7493055555555556 | 0 |
| 0.75 | 0 |
| 0.7506944444444444 | 0 |
| 0.751388888888889 | 0 |
| 0.7520833333333333 | 0 |
| 0.7527777777777778 | 0 |
| 0.7534722222222222 | 0 |
| 0.7541666666666668 | 0 |
| 0.7548611111111111 | 0 |
| 0.7555555555555555 | 0 |
| 0.75625 | 0 |
| 0.7569444444444445 | 0 |
| 0.7576388888888889 | 0 |
| 0.7583333333333333 | 0 |
| 0.7590277777777777 | 0 |
| 0.7597222222222223 | 0 |
| 0.7604166666666666 | 0 |
| 0.7611111111111111 | 0 |
| 0.7618055555555556 | 0 |
| 0.7625000000000001 | 0 |
| 0.7631944444444444 | 0 |
| 0.7638888888888888 | 0 |
| 0.7645833333333334 | 0 |
| 0.7652777777777778 | 0 |
| 0.7659722222222222 | 0 |
| 0.7666666666666666 | 0 |
| 0.7673611111111112 | 0 |
| 0.7680555555555556 | 0 |
| 0.7687499999999999 | 0 |
| 0.7694444444444444 | 0 |
| 0.7701388888888889 | 0 |
| 0.7708333333333334 | 0 |
| 0.7715277777777777 | 0 |
| 0.7722222222222223 | 0 |
| 0.7729166666666667 | 0 |
| 0.7736111111111111 | 0 |
| 0.7743055555555555 | 0 |
| 0.775 | 0 |
| 0.7756944444444445 | 0 |
| 0.7763888888888889 | 0 |
| 0.7770833333333332 | 0 |
| 0.7777777777777778 | 0 |
| 0.7784722222222222 | 0 |
| 0.7791666666666667 | 0 |
| 0.779861111111111 | 0 |
| 0.7805555555555556 | 0 |
| 0.78125 | 0 |
| 0.7819444444444444 | 0 |
| 0.782638888888889 | 0 |
| 0.7833333333333333 | 0 |
| 0.7840277777777778 | 0 |
| 0.7847222222222222 | 0 |
| 0.7854166666666668 | 0 |
| 0.7861111111111111 | 0 |
| 0.7868055555555555 | 0 |
| 0.7875 | 0 |
| 0.7881944444444445 | 0 |
| 0.7888888888888889 | 0 |
| 0.7895833333333333 | 0 |
| 0.7902777777777777 | 0 |
| 0.7909722222222223 | 0 |
| 0.7916666666666666 | 0 |
| 0.7923611111111111 | 0 |
| 0.7930555555555556 | 0 |
| 0.7937500000000001 | 0 |
| 0.7944444444444444 | 0 |
| 0.7951388888888888 | 0 |
| 0.7958333333333334 | 0 |
| 0.7965277777777778 | 0 |
| 0.7972222222222222 | 0 |
| 0.7979166666666666 | 0 |
| 0.7986111111111112 | 0 |
| 0.7993055555555556 | 0 |
| 0.7999999999999999 | 0 |
| 0.8006944444444444 | 0 |
| 0.8013888888888889 | 0 |
| 0.8020833333333334 | 0 |
| 0.8027777777777777 | 0 |
| 0.8034722222222223 | 0 |
| 0.8041666666666667 | 0 |
| 0.8048611111111111 | 0 |
| 0.8055555555555555 | 0 |
| 0.80625 | 0 |
| 0.8069444444444445 | 0 |
| 0.8076388888888889 | 0 |
| 0.8083333333333332 | 0 |
| 0.8090277777777778 | 0 |
| 0.8097222222222222 | 0 |
| 0.8104166666666667 | 0 |
| 0.811111111111111 | 0 |
| 0.8118055555555556 | 0 |
| 0.8125 | 0 |
| 0.8131944444444444 | 0 |
| 0.813888888888889 | 0 |
| 0.8145833333333333 | 0 |
| 0.8152777777777778 | 0 |
| 0.8159722222222222 | 0 |
| 0.8166666666666668 | 0 |
| 0.8173611111111111 | 0 |
| 0.8180555555555555 | 0 |
| 0.81875 | 0 |
| 0.8194444444444445 | 0 |
| 0.8201388888888889 | 0 |
| 0.8208333333333333 | 0 |
| 0.8215277777777777 | 0 |
| 0.8222222222222223 | 0 |
| 0.8229166666666666 | 0 |
| 0.8236111111111111 | 0 |
| 0.8243055555555556 | 0 |
| 0.8250000000000001 | 0 |
| 0.8256944444444444 | 0 |
| 0.8263888888888888 | 0 |
| 0.8270833333333334 | 0 |
| 0.8277777777777778 | 0 |
| 0.8284722222222222 | 0 |
| 0.8291666666666666 | 0 |
| 0.8298611111111112 | 0 |
| 0.8305555555555556 | 0 |
| 0.8312499999999999 | 0 |
| 0.8319444444444444 | 0 |
| 0.8326388888888889 | 0 |
| 0.8333333333333334 | 0 |
| 0.8340277777777777 | 0 |
| 0.8347222222222223 | 0 |
| 0.8354166666666667 | 0 |
| 0.8361111111111111 | 0 |
| 0.8368055555555555 | 0 |
| 0.8375 | 0 |
| 0.8381944444444445 | 0 |
| 0.8388888888888889 | 0 |
| 0.8395833333333332 | 0 |
| 0.8402777777777778 | 0 |
| 0.8409722222222222 | 0 |
| 0.8416666666666667 | 0 |
| 0.842361111111111 | 0 |
| 0.8430555555555556 | 0 |
| 0.84375 | 0 |
| 0.8444444444444444 | 0 |
| 0.845138888888889 | 0 |
| 0.8458333333333333 | 0 |
| 0.8465277777777778 | 0 |
| 0.8472222222222222 | 0 |
| 0.8479166666666668 | 0 |
| 0.8486111111111111 | 0 |
| 0.8493055555555555 | 0 |
| 0.85 | 0 |
| 0.8506944444444445 | 0 |
| 0.8513888888888889 | 0 |
| 0.8520833333333333 | 0 |
| 0.8527777777777777 | 0 |
| 0.8534722222222223 | 0 |
| 0.8541666666666666 | 0 |
| 0.8548611111111111 | 0 |
| 0.8555555555555556 | 0 |
| 0.8562500000000001 | 0 |
| 0.8569444444444444 | 0 |
| 0.8576388888888888 | 0 |
| 0.8583333333333334 | 0 |
| 0.8590277777777778 | 0 |
| 0.8597222222222222 | 0 |
| 0.8604166666666666 | 0 |
| 0.8611111111111112 | 0 |
| 0.8618055555555556 | 0 |
| 0.8624999999999999 | 0 |
| 0.8631944444444444 | 0 |
| 0.8638888888888889 | 0 |
| 0.8645833333333334 | 0 |
| 0.8652777777777777 | 0 |
| 0.8659722222222223 | 0 |
| 0.8666666666666667 | 0 |
| 0.8673611111111111 | 0 |
| 0.8680555555555555 | 0 |
| 0.86875 | 0 |
| 0.8694444444444445 | 0 |
| 0.8701388888888889 | 0 |
| 0.8708333333333332 | 0 |
| 0.8715277777777778 | 0 |
| 0.8722222222222222 | 0 |
| 0.8729166666666667 | 0 |
| 0.873611111111111 | 0 |
| 0.8743055555555556 | 0 |
| 0.875 | 0 |
| 0.8756944444444444 | 0 |
| 0.876388888888889 | 0 |
| 0.8770833333333333 | 0 |
| 0.8777777777777778 | 0 |
| 0.8784722222222222 | 0 |
| 0.8791666666666668 | 0 |
| 0.8798611111111111 | 0 |
| 0.8805555555555555 | 0 |
| 0.88125 | 0 |
| 0.8819444444444445 | 0 |
| 0.8826388888888889 | 0 |
| 0.8833333333333333 | 0 |
| 0.8840277777777777 | 0 |
| 0.8847222222222223 | 0 |
| 0.8854166666666666 | 0 |
| 0.8861111111111111 | 0 |
| 0.8868055555555556 | 0 |
| 0.8875000000000001 | 0 |
| 0.8881944444444444 | 0 |
| 0.8888888888888888 | 0 |
| 0.8895833333333334 | 0 |
| 0.8902777777777778 | 0 |
| 0.8909722222222222 | 0 |
| 0.8916666666666666 | 0 |
| 0.8923611111111112 | 0 |
| 0.8930555555555556 | 0 |
| 0.8937499999999999 | 0 |
| 0.8944444444444444 | 0 |
| 0.8951388888888889 | 0 |
| 0.8958333333333334 | 0 |
| 0.8965277777777777 | 0 |
| 0.8972222222222223 | 0 |
| 0.8979166666666667 | 0 |
| 0.8986111111111111 | 0 |
| 0.8993055555555555 | 0 |
| 0.9 | 0 |
| 0.9006944444444445 | 0 |
| 0.9013888888888889 | 0 |
| 0.9020833333333332 | 0 |
| 0.9027777777777778 | 0 |
| 0.9034722222222222 | 0 |
| 0.9041666666666667 | 0 |
| 0.904861111111111 | 0 |
| 0.9055555555555556 | 0 |
| 0.90625 | 0 |
| 0.9069444444444444 | 0 |
| 0.907638888888889 | 0 |
| 0.9083333333333333 | 0 |
| 0.9090277777777778 | 0 |
| 0.9097222222222222 | 0 |
| 0.9104166666666668 | 0 |
| 0.9111111111111111 | 0 |
| 0.9118055555555555 | 0 |
| 0.9125 | 0 |
| 0.9131944444444445 | 0 |
| 0.9138888888888889 | 0 |
| 0.9145833333333333 | 0 |
| 0.9152777777777777 | 0 |
| 0.9159722222222223 | 0 |
| 0.9166666666666666 | 0 |
| 0.9173611111111111 | 0 |
| 0.9180555555555556 | 0 |
| 0.9187500000000001 | 0 |
| 0.9194444444444444 | 0 |
| 0.9201388888888888 | 0 |
| 0.9208333333333334 | 0 |
| 0.9215277777777778 | 0 |
| 0.9222222222222222 | 0 |
| 0.9229166666666666 | 0 |
| 0.9236111111111112 | 0 |
| 0.9243055555555556 | 0 |
| 0.9249999999999999 | 0 |
| 0.9256944444444444 | 0 |
| 0.9263888888888889 | 0 |
| 0.9270833333333334 | 0 |
| 0.9277777777777777 | 0 |
| 0.9284722222222223 | 0 |
| 0.9291666666666667 | 0 |
| 0.9298611111111111 | 0 |
| 0.9305555555555555 | 0 |
| 0.93125 | 0 |
| 0.9319444444444445 | 0 |
| 0.9326388888888889 | 0 |
| 0.9333333333333332 | 0 |
| 0.9340277777777778 | 0 |
| 0.9347222222222222 | 0 |
| 0.9354166666666667 | 0 |
| 0.936111111111111 | 0 |
| 0.9368055555555556 | 0 |
| 0.9375 | 0 |
| 0.9381944444444444 | 0 |
| 0.938888888888889 | 0 |
| 0.9395833333333333 | 0 |
| 0.9402777777777778 | 0 |
| 0.9409722222222222 | 0 |
| 0.9416666666666668 | 0 |
| 0.9423611111111111 | 0 |
| 0.9430555555555555 | 0 |
| 0.94375 | 0 |
| 0.9444444444444445 | 0 |
| 0.9451388888888889 | 0 |
| 0.9458333333333333 | 0 |
| 0.9465277777777777 | 0 |
| 0.9472222222222223 | 0 |
| 0.9479166666666666 | 0 |
| 0.9486111111111111 | 0 |
| 0.9493055555555556 | 0 |
| 0.9500000000000001 | 0 |
| 0.9506944444444444 | 0 |
| 0.9513888888888888 | 0 |
| 0.9520833333333334 | 0 |
| 0.9527777777777778 | 0 |
| 0.9534722222222222 | 0 |
| 0.9541666666666666 | 0 |
| 0.9548611111111112 | 0 |
| 0.9555555555555556 | 0 |
| 0.9562499999999999 | 0 |
| 0.9569444444444444 | 0 |
| 0.9576388888888889 | 0 |
| 0.9583333333333334 | 0 |
| 0.9590277777777777 | 0 |
| 0.9597222222222223 | 0 |
| 0.9604166666666667 | 0 |
| 0.9611111111111111 | 0 |
| 0.9618055555555555 | 0 |
| 0.9625 | 0 |
| 0.9631944444444445 | 0 |
| 0.9638888888888889 | 0 |
| 0.9645833333333332 | 0 |
| 0.9652777777777778 | 0 |
| 0.9659722222222222 | 0 |
| 0.9666666666666667 | 0 |
| 0.967361111111111 | 0 |
| 0.9680555555555556 | 0 |
| 0.96875 | 0 |
| 0.9694444444444444 | 0 |
| 0.970138888888889 | 0 |
| 0.9708333333333333 | 0 |
| 0.9715277777777778 | 0 |
| 0.9722222222222222 | 0 |
| 0.9729166666666668 | 0 |
| 0.9736111111111111 | 0 |
| 0.9743055555555555 | 0 |
| 0.975 | 0 |
| 0.9756944444444445 | 0 |
| 0.9763888888888889 | 0 |
| 0.9770833333333333 | 0 |
| 0.9777777777777777 | 0 |
| 0.9784722222222223 | 0 |
| 0.9791666666666666 | 0 |
| 0.9798611111111111 | 0 |
| 0.9805555555555556 | 0 |
| 0.9812500000000001 | 0 |
| 0.9819444444444444 | 0 |
| 0.9826388888888888 | 0 |
| 0.9833333333333334 | 0 |
| 0.9840277777777778 | 0 |
| 0.9847222222222222 | 0 |
| 0.9854166666666666 | 0 |
| 0.9861111111111112 | 0 |
| 0.9868055555555556 | 0 |
| 0.9874999999999999 | 0 |
| 0.9881944444444444 | 0 |
| 0.9888888888888889 | 0 |
| 0.9895833333333334 | 0 |
| 0.9902777777777777 | 0 |
| 0.9909722222222223 | 0 |
| 0.9916666666666667 | 0 |
| 0.9923611111111111 | 0 |
| 0.9930555555555555 | 0 |
| 0.99375 | 0 |
| 0.9944444444444445 | 0 |
| 0.9951388888888889 | 0 |
| 0.9958333333333332 | 0 |
| 0.9965277777777778 | 0 |
| 0.9972222222222222 | 0 |
| 0.9979166666666667 | 0 |
| 0.998611111111111 | 0 |
| 0.9993055555555556 | 0 |